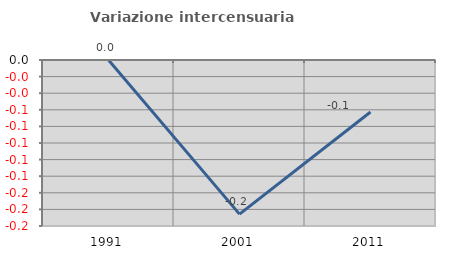
| Category | Variazione intercensuaria annua |
|---|---|
| 1991.0 | 0 |
| 2001.0 | -0.186 |
| 2011.0 | -0.063 |